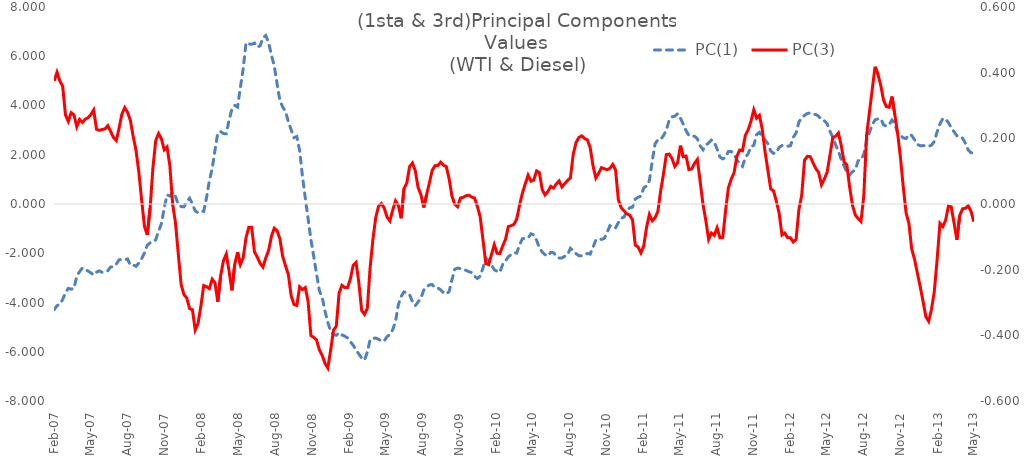
| Category | PC(1) |
|---|---|
| 2007-02-05 | -4.292 |
| 2007-02-12 | -4.127 |
| 2007-02-19 | -4.081 |
| 2007-02-26 | -3.876 |
| 2007-03-05 | -3.605 |
| 2007-03-12 | -3.427 |
| 2007-03-19 | -3.458 |
| 2007-03-26 | -3.432 |
| 2007-04-02 | -2.936 |
| 2007-04-09 | -2.745 |
| 2007-04-16 | -2.6 |
| 2007-04-23 | -2.654 |
| 2007-04-30 | -2.719 |
| 2007-05-07 | -2.798 |
| 2007-05-14 | -2.881 |
| 2007-05-21 | -2.766 |
| 2007-05-28 | -2.713 |
| 2007-06-04 | -2.775 |
| 2007-06-11 | -2.755 |
| 2007-06-18 | -2.71 |
| 2007-06-25 | -2.555 |
| 2007-07-02 | -2.553 |
| 2007-07-09 | -2.439 |
| 2007-07-16 | -2.268 |
| 2007-07-23 | -2.246 |
| 2007-07-30 | -2.26 |
| 2007-08-06 | -2.23 |
| 2007-08-13 | -2.484 |
| 2007-08-20 | -2.476 |
| 2007-08-27 | -2.532 |
| 2007-09-03 | -2.399 |
| 2007-09-10 | -2.214 |
| 2007-09-17 | -1.99 |
| 2007-09-24 | -1.674 |
| 2007-10-01 | -1.577 |
| 2007-10-08 | -1.552 |
| 2007-10-15 | -1.451 |
| 2007-10-22 | -1.107 |
| 2007-10-29 | -0.797 |
| 2007-11-05 | -0.162 |
| 2007-11-12 | 0.37 |
| 2007-11-19 | 0.325 |
| 2007-11-26 | 0.487 |
| 2007-12-03 | 0.308 |
| 2007-12-10 | -0.038 |
| 2007-12-17 | -0.105 |
| 2007-12-24 | -0.114 |
| 2007-12-31 | 0.098 |
| 2008-01-07 | 0.233 |
| 2008-01-14 | -0.007 |
| 2008-01-21 | -0.285 |
| 2008-01-28 | -0.352 |
| 2008-02-04 | -0.287 |
| 2008-02-11 | -0.299 |
| 2008-02-18 | 0.251 |
| 2008-02-25 | 0.944 |
| 2008-03-03 | 1.435 |
| 2008-03-10 | 2.189 |
| 2008-03-17 | 2.888 |
| 2008-03-24 | 2.939 |
| 2008-03-31 | 2.859 |
| 2008-04-07 | 2.853 |
| 2008-04-14 | 3.41 |
| 2008-04-21 | 3.857 |
| 2008-04-28 | 4.005 |
| 2008-05-05 | 3.937 |
| 2008-05-12 | 4.732 |
| 2008-05-19 | 5.494 |
| 2008-05-26 | 6.551 |
| 2008-06-02 | 6.5 |
| 2008-06-09 | 6.486 |
| 2008-06-16 | 6.538 |
| 2008-06-23 | 6.369 |
| 2008-06-30 | 6.424 |
| 2008-07-07 | 6.751 |
| 2008-07-14 | 6.842 |
| 2008-07-21 | 6.561 |
| 2008-07-28 | 6.052 |
| 2008-08-04 | 5.615 |
| 2008-08-11 | 4.893 |
| 2008-08-18 | 4.197 |
| 2008-08-25 | 3.941 |
| 2008-09-01 | 3.755 |
| 2008-09-08 | 3.345 |
| 2008-09-15 | 3.011 |
| 2008-09-22 | 2.697 |
| 2008-09-29 | 2.739 |
| 2008-10-06 | 2.172 |
| 2008-10-13 | 1.129 |
| 2008-10-20 | 0.254 |
| 2008-10-27 | -0.591 |
| 2008-11-03 | -1.442 |
| 2008-11-10 | -2.132 |
| 2008-11-17 | -2.838 |
| 2008-11-24 | -3.52 |
| 2008-12-01 | -3.788 |
| 2008-12-08 | -4.352 |
| 2008-12-15 | -4.807 |
| 2008-12-22 | -5.16 |
| 2008-12-29 | -5.305 |
| 2009-01-05 | -5.334 |
| 2009-01-12 | -5.226 |
| 2009-01-19 | -5.318 |
| 2009-01-26 | -5.367 |
| 2009-02-02 | -5.44 |
| 2009-02-09 | -5.587 |
| 2009-02-16 | -5.74 |
| 2009-02-23 | -5.93 |
| 2009-03-02 | -6.091 |
| 2009-03-09 | -6.259 |
| 2009-03-16 | -6.34 |
| 2009-03-23 | -6.018 |
| 2009-03-30 | -5.505 |
| 2009-04-06 | -5.458 |
| 2009-04-13 | -5.444 |
| 2009-04-20 | -5.492 |
| 2009-04-27 | -5.57 |
| 2009-05-04 | -5.56 |
| 2009-05-11 | -5.387 |
| 2009-05-18 | -5.301 |
| 2009-05-25 | -5.113 |
| 2009-06-01 | -4.768 |
| 2009-06-08 | -4.091 |
| 2009-06-15 | -3.752 |
| 2009-06-22 | -3.57 |
| 2009-06-29 | -3.602 |
| 2009-07-06 | -3.683 |
| 2009-07-13 | -3.968 |
| 2009-07-20 | -4.129 |
| 2009-07-27 | -3.98 |
| 2009-08-03 | -3.828 |
| 2009-08-10 | -3.496 |
| 2009-08-17 | -3.375 |
| 2009-08-24 | -3.285 |
| 2009-08-31 | -3.272 |
| 2009-09-07 | -3.399 |
| 2009-09-14 | -3.411 |
| 2009-09-21 | -3.485 |
| 2009-09-28 | -3.601 |
| 2009-10-05 | -3.659 |
| 2009-10-12 | -3.555 |
| 2009-10-19 | -3.073 |
| 2009-10-26 | -2.649 |
| 2009-11-02 | -2.599 |
| 2009-11-09 | -2.625 |
| 2009-11-16 | -2.668 |
| 2009-11-23 | -2.693 |
| 2009-11-30 | -2.748 |
| 2009-12-07 | -2.784 |
| 2009-12-14 | -2.929 |
| 2009-12-21 | -3.024 |
| 2009-12-28 | -2.936 |
| 2010-01-04 | -2.598 |
| 2010-01-11 | -2.21 |
| 2010-01-18 | -2.283 |
| 2010-01-25 | -2.465 |
| 2010-02-01 | -2.672 |
| 2010-02-08 | -2.73 |
| 2010-02-15 | -2.772 |
| 2010-02-22 | -2.447 |
| 2010-03-01 | -2.305 |
| 2010-03-08 | -2.141 |
| 2010-03-15 | -2.059 |
| 2010-03-22 | -1.981 |
| 2010-03-29 | -1.989 |
| 2010-04-05 | -1.648 |
| 2010-04-12 | -1.407 |
| 2010-04-19 | -1.395 |
| 2010-04-26 | -1.382 |
| 2010-05-03 | -1.209 |
| 2010-05-10 | -1.255 |
| 2010-05-17 | -1.467 |
| 2010-05-24 | -1.788 |
| 2010-05-31 | -1.945 |
| 2010-06-07 | -2.057 |
| 2010-06-14 | -2.112 |
| 2010-06-21 | -1.968 |
| 2010-06-28 | -1.977 |
| 2010-07-05 | -2.118 |
| 2010-07-12 | -2.194 |
| 2010-07-19 | -2.194 |
| 2010-07-26 | -2.12 |
| 2010-08-02 | -2.059 |
| 2010-08-09 | -1.8 |
| 2010-08-16 | -1.9 |
| 2010-08-23 | -2.019 |
| 2010-08-30 | -2.1 |
| 2010-09-06 | -2.106 |
| 2010-09-13 | -2.064 |
| 2010-09-20 | -2.01 |
| 2010-09-27 | -2.035 |
| 2010-10-04 | -1.767 |
| 2010-10-11 | -1.46 |
| 2010-10-18 | -1.419 |
| 2010-10-25 | -1.439 |
| 2010-11-01 | -1.4 |
| 2010-11-08 | -1.161 |
| 2010-11-15 | -0.881 |
| 2010-11-22 | -0.967 |
| 2010-11-29 | -0.97 |
| 2010-12-06 | -0.752 |
| 2010-12-13 | -0.581 |
| 2010-12-20 | -0.529 |
| 2010-12-27 | -0.31 |
| 2011-01-03 | -0.153 |
| 2011-01-10 | -0.129 |
| 2011-01-17 | 0.196 |
| 2011-01-24 | 0.277 |
| 2011-01-31 | 0.316 |
| 2011-02-07 | 0.659 |
| 2011-02-14 | 0.733 |
| 2011-02-21 | 0.949 |
| 2011-02-28 | 1.73 |
| 2011-03-07 | 2.443 |
| 2011-03-14 | 2.606 |
| 2011-03-21 | 2.619 |
| 2011-03-28 | 2.78 |
| 2011-04-04 | 2.995 |
| 2011-04-11 | 3.413 |
| 2011-04-18 | 3.538 |
| 2011-04-25 | 3.566 |
| 2011-05-02 | 3.666 |
| 2011-05-09 | 3.487 |
| 2011-05-16 | 3.241 |
| 2011-05-23 | 2.978 |
| 2011-05-30 | 2.781 |
| 2011-06-06 | 2.752 |
| 2011-06-13 | 2.753 |
| 2011-06-20 | 2.648 |
| 2011-06-27 | 2.361 |
| 2011-07-04 | 2.203 |
| 2011-07-11 | 2.387 |
| 2011-07-18 | 2.479 |
| 2011-07-25 | 2.594 |
| 2011-08-01 | 2.522 |
| 2011-08-08 | 2.225 |
| 2011-08-15 | 1.91 |
| 2011-08-22 | 1.833 |
| 2011-08-29 | 1.888 |
| 2011-09-05 | 2.136 |
| 2011-09-12 | 2.129 |
| 2011-09-19 | 2.031 |
| 2011-09-26 | 1.799 |
| 2011-10-03 | 1.621 |
| 2011-10-10 | 1.528 |
| 2011-10-17 | 1.888 |
| 2011-10-24 | 2.043 |
| 2011-10-31 | 2.334 |
| 2011-11-07 | 2.381 |
| 2011-11-14 | 2.818 |
| 2011-11-21 | 2.91 |
| 2011-11-28 | 2.727 |
| 2011-12-05 | 2.61 |
| 2011-12-12 | 2.444 |
| 2011-12-19 | 2.156 |
| 2011-12-26 | 2.054 |
| 2012-01-02 | 2.08 |
| 2012-01-09 | 2.299 |
| 2012-01-16 | 2.374 |
| 2012-01-23 | 2.352 |
| 2012-01-30 | 2.349 |
| 2012-02-06 | 2.362 |
| 2012-02-13 | 2.709 |
| 2012-02-20 | 2.882 |
| 2012-02-27 | 3.332 |
| 2012-03-05 | 3.507 |
| 2012-03-12 | 3.601 |
| 2012-03-19 | 3.677 |
| 2012-03-26 | 3.696 |
| 2012-04-02 | 3.646 |
| 2012-04-09 | 3.635 |
| 2012-04-16 | 3.565 |
| 2012-04-23 | 3.423 |
| 2012-04-30 | 3.377 |
| 2012-05-07 | 3.259 |
| 2012-05-14 | 2.957 |
| 2012-05-21 | 2.707 |
| 2012-05-28 | 2.408 |
| 2012-06-04 | 2.141 |
| 2012-06-11 | 1.812 |
| 2012-06-18 | 1.541 |
| 2012-06-25 | 1.292 |
| 2012-07-02 | 1.178 |
| 2012-07-09 | 1.314 |
| 2012-07-16 | 1.378 |
| 2012-07-23 | 1.755 |
| 2012-07-30 | 1.789 |
| 2012-08-06 | 2.017 |
| 2012-08-13 | 2.572 |
| 2012-08-20 | 2.902 |
| 2012-08-27 | 3.213 |
| 2012-09-03 | 3.417 |
| 2012-09-10 | 3.454 |
| 2012-09-17 | 3.471 |
| 2012-09-24 | 3.22 |
| 2012-10-01 | 3.158 |
| 2012-10-08 | 3.225 |
| 2012-10-15 | 3.411 |
| 2012-10-22 | 3.262 |
| 2012-10-29 | 2.874 |
| 2012-11-05 | 2.794 |
| 2012-11-12 | 2.682 |
| 2012-11-19 | 2.659 |
| 2012-11-26 | 2.825 |
| 2012-12-03 | 2.782 |
| 2012-12-10 | 2.608 |
| 2012-12-17 | 2.419 |
| 2012-12-24 | 2.366 |
| 2012-12-31 | 2.372 |
| 2013-01-07 | 2.364 |
| 2013-01-14 | 2.344 |
| 2013-01-21 | 2.387 |
| 2013-01-28 | 2.543 |
| 2013-02-04 | 2.927 |
| 2013-02-11 | 3.252 |
| 2013-02-18 | 3.47 |
| 2013-02-25 | 3.452 |
| 2013-03-04 | 3.301 |
| 2013-03-11 | 3.101 |
| 2013-03-18 | 2.931 |
| 2013-03-25 | 2.773 |
| 2013-04-01 | 2.758 |
| 2013-04-08 | 2.675 |
| 2013-04-15 | 2.471 |
| 2013-04-22 | 2.196 |
| 2013-04-29 | 2.084 |
| 2013-05-06 | 2.053 |